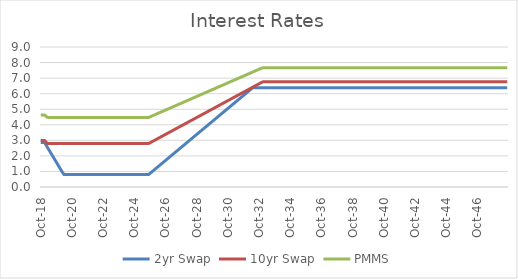
| Category | 2yr Swap | 10yr Swap | PMMS |
|---|---|---|---|
| 2018-10-31 | 2.86 | 2.99 | 4.63 |
| 2018-11-30 | 2.86 | 2.99 | 4.63 |
| 2018-12-31 | 2.86 | 2.99 | 4.63 |
| 2019-01-31 | 2.86 | 2.99 | 4.63 |
| 2019-02-28 | 2.721 | 2.9 | 4.557 |
| 2019-03-31 | 2.581 | 2.809 | 4.484 |
| 2019-04-30 | 2.442 | 2.792 | 4.47 |
| 2019-05-31 | 2.303 | 2.792 | 4.47 |
| 2019-06-30 | 2.163 | 2.792 | 4.47 |
| 2019-07-31 | 2.024 | 2.792 | 4.47 |
| 2019-08-31 | 1.885 | 2.792 | 4.47 |
| 2019-09-30 | 1.745 | 2.792 | 4.469 |
| 2019-10-31 | 1.606 | 2.792 | 4.469 |
| 2019-11-30 | 1.467 | 2.792 | 4.469 |
| 2019-12-31 | 1.327 | 2.792 | 4.469 |
| 2020-01-31 | 1.188 | 2.792 | 4.469 |
| 2020-02-29 | 1.049 | 2.792 | 4.469 |
| 2020-03-31 | 0.909 | 2.792 | 4.469 |
| 2020-04-30 | 0.798 | 2.792 | 4.469 |
| 2020-05-31 | 0.798 | 2.792 | 4.469 |
| 2020-06-30 | 0.798 | 2.792 | 4.469 |
| 2020-07-31 | 0.798 | 2.792 | 4.469 |
| 2020-08-31 | 0.798 | 2.792 | 4.469 |
| 2020-09-30 | 0.798 | 2.792 | 4.469 |
| 2020-10-31 | 0.798 | 2.792 | 4.469 |
| 2020-11-30 | 0.798 | 2.792 | 4.469 |
| 2020-12-31 | 0.798 | 2.792 | 4.469 |
| 2021-01-31 | 0.798 | 2.792 | 4.469 |
| 2021-02-28 | 0.798 | 2.792 | 4.469 |
| 2021-03-31 | 0.798 | 2.792 | 4.469 |
| 2021-04-30 | 0.798 | 2.792 | 4.469 |
| 2021-05-31 | 0.798 | 2.792 | 4.469 |
| 2021-06-30 | 0.798 | 2.792 | 4.469 |
| 2021-07-31 | 0.798 | 2.792 | 4.469 |
| 2021-08-31 | 0.798 | 2.792 | 4.469 |
| 2021-09-30 | 0.798 | 2.792 | 4.469 |
| 2021-10-31 | 0.798 | 2.792 | 4.469 |
| 2021-11-30 | 0.798 | 2.792 | 4.469 |
| 2021-12-31 | 0.798 | 2.792 | 4.469 |
| 2022-01-31 | 0.798 | 2.792 | 4.469 |
| 2022-02-28 | 0.798 | 2.792 | 4.469 |
| 2022-03-31 | 0.798 | 2.792 | 4.469 |
| 2022-04-30 | 0.798 | 2.792 | 4.469 |
| 2022-05-31 | 0.798 | 2.792 | 4.469 |
| 2022-06-30 | 0.798 | 2.792 | 4.469 |
| 2022-07-31 | 0.798 | 2.792 | 4.469 |
| 2022-08-31 | 0.798 | 2.792 | 4.469 |
| 2022-09-30 | 0.798 | 2.792 | 4.469 |
| 2022-10-31 | 0.798 | 2.792 | 4.469 |
| 2022-11-30 | 0.798 | 2.792 | 4.469 |
| 2022-12-31 | 0.798 | 2.792 | 4.469 |
| 2023-01-31 | 0.798 | 2.792 | 4.469 |
| 2023-02-28 | 0.798 | 2.792 | 4.469 |
| 2023-03-31 | 0.798 | 2.792 | 4.469 |
| 2023-04-30 | 0.798 | 2.792 | 4.469 |
| 2023-05-31 | 0.798 | 2.792 | 4.469 |
| 2023-06-30 | 0.798 | 2.792 | 4.469 |
| 2023-07-31 | 0.798 | 2.792 | 4.469 |
| 2023-08-31 | 0.798 | 2.792 | 4.469 |
| 2023-09-30 | 0.798 | 2.792 | 4.469 |
| 2023-10-31 | 0.798 | 2.792 | 4.469 |
| 2023-11-30 | 0.798 | 2.792 | 4.469 |
| 2023-12-31 | 0.798 | 2.792 | 4.469 |
| 2024-01-31 | 0.798 | 2.792 | 4.469 |
| 2024-02-29 | 0.798 | 2.792 | 4.469 |
| 2024-03-31 | 0.798 | 2.792 | 4.469 |
| 2024-04-30 | 0.798 | 2.792 | 4.469 |
| 2024-05-31 | 0.798 | 2.792 | 4.469 |
| 2024-06-30 | 0.798 | 2.792 | 4.469 |
| 2024-07-31 | 0.798 | 2.792 | 4.469 |
| 2024-08-31 | 0.798 | 2.792 | 4.469 |
| 2024-09-30 | 0.798 | 2.792 | 4.469 |
| 2024-10-31 | 0.798 | 2.792 | 4.469 |
| 2024-11-30 | 0.798 | 2.792 | 4.469 |
| 2024-12-31 | 0.798 | 2.792 | 4.469 |
| 2025-01-31 | 0.798 | 2.792 | 4.469 |
| 2025-02-28 | 0.798 | 2.792 | 4.469 |
| 2025-03-31 | 0.798 | 2.792 | 4.469 |
| 2025-04-30 | 0.798 | 2.792 | 4.469 |
| 2025-05-31 | 0.798 | 2.792 | 4.469 |
| 2025-06-30 | 0.798 | 2.792 | 4.469 |
| 2025-07-31 | 0.798 | 2.792 | 4.469 |
| 2025-08-31 | 0.798 | 2.792 | 4.469 |
| 2025-09-30 | 0.798 | 2.792 | 4.469 |
| 2025-10-31 | 0.868 | 2.837 | 4.505 |
| 2025-11-30 | 0.938 | 2.882 | 4.542 |
| 2025-12-31 | 1.007 | 2.928 | 4.578 |
| 2026-01-31 | 1.077 | 2.973 | 4.615 |
| 2026-02-28 | 1.147 | 3.018 | 4.651 |
| 2026-03-31 | 1.216 | 3.063 | 4.688 |
| 2026-04-30 | 1.286 | 3.108 | 4.724 |
| 2026-05-31 | 1.356 | 3.154 | 4.761 |
| 2026-06-30 | 1.425 | 3.199 | 4.797 |
| 2026-07-31 | 1.495 | 3.244 | 4.834 |
| 2026-08-31 | 1.565 | 3.289 | 4.87 |
| 2026-09-30 | 1.634 | 3.334 | 4.906 |
| 2026-10-31 | 1.704 | 3.38 | 4.943 |
| 2026-11-30 | 1.774 | 3.425 | 4.979 |
| 2026-12-31 | 1.843 | 3.47 | 5.016 |
| 2027-01-31 | 1.913 | 3.515 | 5.052 |
| 2027-02-28 | 1.983 | 3.561 | 5.089 |
| 2027-03-31 | 2.052 | 3.606 | 5.125 |
| 2027-04-30 | 2.122 | 3.651 | 5.162 |
| 2027-05-31 | 2.192 | 3.696 | 5.198 |
| 2027-06-30 | 2.261 | 3.741 | 5.235 |
| 2027-07-31 | 2.331 | 3.787 | 5.271 |
| 2027-08-31 | 2.401 | 3.832 | 5.308 |
| 2027-09-30 | 2.47 | 3.877 | 5.344 |
| 2027-10-31 | 2.54 | 3.922 | 5.381 |
| 2027-11-30 | 2.61 | 3.968 | 5.417 |
| 2027-12-31 | 2.679 | 4.013 | 5.454 |
| 2028-01-31 | 2.749 | 4.058 | 5.49 |
| 2028-02-29 | 2.819 | 4.103 | 5.527 |
| 2028-03-31 | 2.888 | 4.148 | 5.563 |
| 2028-04-30 | 2.958 | 4.194 | 5.6 |
| 2028-05-31 | 3.028 | 4.239 | 5.636 |
| 2028-06-30 | 3.097 | 4.284 | 5.673 |
| 2028-07-31 | 3.167 | 4.329 | 5.709 |
| 2028-08-31 | 3.237 | 4.375 | 5.746 |
| 2028-09-30 | 3.306 | 4.42 | 5.782 |
| 2028-10-31 | 3.376 | 4.465 | 5.818 |
| 2028-11-30 | 3.446 | 4.51 | 5.855 |
| 2028-12-31 | 3.515 | 4.555 | 5.891 |
| 2029-01-31 | 3.585 | 4.601 | 5.928 |
| 2029-02-28 | 3.655 | 4.646 | 5.964 |
| 2029-03-31 | 3.724 | 4.691 | 6.001 |
| 2029-04-30 | 3.794 | 4.736 | 6.037 |
| 2029-05-31 | 3.864 | 4.782 | 6.074 |
| 2029-06-30 | 3.933 | 4.827 | 6.11 |
| 2029-07-31 | 4.003 | 4.872 | 6.147 |
| 2029-08-31 | 4.073 | 4.917 | 6.183 |
| 2029-09-30 | 4.142 | 4.962 | 6.22 |
| 2029-10-31 | 4.212 | 5.008 | 6.256 |
| 2029-11-30 | 4.282 | 5.053 | 6.293 |
| 2029-12-31 | 4.351 | 5.098 | 6.329 |
| 2030-01-31 | 4.421 | 5.143 | 6.366 |
| 2030-02-28 | 4.491 | 5.189 | 6.402 |
| 2030-03-31 | 4.56 | 5.234 | 6.439 |
| 2030-04-30 | 4.63 | 5.279 | 6.475 |
| 2030-05-31 | 4.7 | 5.324 | 6.512 |
| 2030-06-30 | 4.769 | 5.369 | 6.548 |
| 2030-07-31 | 4.839 | 5.415 | 6.585 |
| 2030-08-31 | 4.909 | 5.46 | 6.621 |
| 2030-09-30 | 4.978 | 5.505 | 6.658 |
| 2030-10-31 | 5.048 | 5.55 | 6.694 |
| 2030-11-30 | 5.118 | 5.596 | 6.73 |
| 2030-12-31 | 5.187 | 5.641 | 6.767 |
| 2031-01-31 | 5.257 | 5.686 | 6.803 |
| 2031-02-28 | 5.327 | 5.731 | 6.84 |
| 2031-03-31 | 5.396 | 5.776 | 6.876 |
| 2031-04-30 | 5.466 | 5.822 | 6.913 |
| 2031-05-31 | 5.536 | 5.867 | 6.949 |
| 2031-06-30 | 5.605 | 5.912 | 6.986 |
| 2031-07-31 | 5.675 | 5.957 | 7.022 |
| 2031-08-31 | 5.745 | 6.003 | 7.059 |
| 2031-09-30 | 5.814 | 6.048 | 7.095 |
| 2031-10-31 | 5.884 | 6.093 | 7.132 |
| 2031-11-30 | 5.954 | 6.138 | 7.168 |
| 2031-12-31 | 6.023 | 6.183 | 7.205 |
| 2032-01-31 | 6.093 | 6.229 | 7.241 |
| 2032-02-29 | 6.163 | 6.274 | 7.278 |
| 2032-03-31 | 6.232 | 6.319 | 7.314 |
| 2032-04-30 | 6.302 | 6.364 | 7.351 |
| 2032-05-31 | 6.372 | 6.409 | 7.387 |
| 2032-06-30 | 6.387 | 6.455 | 7.424 |
| 2032-07-31 | 6.387 | 6.5 | 7.46 |
| 2032-08-31 | 6.387 | 6.545 | 7.496 |
| 2032-09-30 | 6.387 | 6.59 | 7.533 |
| 2032-10-31 | 6.387 | 6.636 | 7.569 |
| 2032-11-30 | 6.387 | 6.681 | 7.606 |
| 2032-12-31 | 6.387 | 6.726 | 7.642 |
| 2033-01-31 | 6.387 | 6.758 | 7.668 |
| 2033-02-28 | 6.387 | 6.758 | 7.668 |
| 2033-03-31 | 6.387 | 6.758 | 7.668 |
| 2033-04-30 | 6.387 | 6.758 | 7.668 |
| 2033-05-31 | 6.387 | 6.758 | 7.668 |
| 2033-06-30 | 6.387 | 6.758 | 7.668 |
| 2033-07-31 | 6.387 | 6.758 | 7.668 |
| 2033-08-31 | 6.387 | 6.758 | 7.668 |
| 2033-09-30 | 6.387 | 6.758 | 7.668 |
| 2033-10-31 | 6.387 | 6.758 | 7.668 |
| 2033-11-30 | 6.387 | 6.758 | 7.668 |
| 2033-12-31 | 6.387 | 6.758 | 7.668 |
| 2034-01-31 | 6.387 | 6.758 | 7.668 |
| 2034-02-28 | 6.387 | 6.758 | 7.668 |
| 2034-03-31 | 6.387 | 6.758 | 7.668 |
| 2034-04-30 | 6.387 | 6.758 | 7.668 |
| 2034-05-31 | 6.387 | 6.758 | 7.668 |
| 2034-06-30 | 6.387 | 6.758 | 7.668 |
| 2034-07-31 | 6.387 | 6.758 | 7.668 |
| 2034-08-31 | 6.387 | 6.758 | 7.668 |
| 2034-09-30 | 6.387 | 6.758 | 7.668 |
| 2034-10-31 | 6.387 | 6.758 | 7.668 |
| 2034-11-30 | 6.387 | 6.758 | 7.668 |
| 2034-12-31 | 6.387 | 6.758 | 7.668 |
| 2035-01-31 | 6.387 | 6.758 | 7.668 |
| 2035-02-28 | 6.387 | 6.758 | 7.668 |
| 2035-03-31 | 6.387 | 6.758 | 7.668 |
| 2035-04-30 | 6.387 | 6.758 | 7.668 |
| 2035-05-31 | 6.387 | 6.758 | 7.668 |
| 2035-06-30 | 6.387 | 6.758 | 7.668 |
| 2035-07-31 | 6.387 | 6.758 | 7.668 |
| 2035-08-31 | 6.387 | 6.758 | 7.668 |
| 2035-09-30 | 6.387 | 6.758 | 7.668 |
| 2035-10-31 | 6.387 | 6.758 | 7.668 |
| 2035-11-30 | 6.387 | 6.758 | 7.668 |
| 2035-12-31 | 6.387 | 6.758 | 7.668 |
| 2036-01-31 | 6.387 | 6.758 | 7.668 |
| 2036-02-29 | 6.387 | 6.758 | 7.668 |
| 2036-03-31 | 6.387 | 6.758 | 7.668 |
| 2036-04-30 | 6.387 | 6.758 | 7.668 |
| 2036-05-31 | 6.387 | 6.758 | 7.668 |
| 2036-06-30 | 6.387 | 6.758 | 7.668 |
| 2036-07-31 | 6.387 | 6.758 | 7.668 |
| 2036-08-31 | 6.387 | 6.758 | 7.668 |
| 2036-09-30 | 6.387 | 6.758 | 7.668 |
| 2036-10-31 | 6.387 | 6.758 | 7.668 |
| 2036-11-30 | 6.387 | 6.758 | 7.668 |
| 2036-12-31 | 6.387 | 6.758 | 7.668 |
| 2037-01-31 | 6.387 | 6.758 | 7.668 |
| 2037-02-28 | 6.387 | 6.758 | 7.668 |
| 2037-03-31 | 6.387 | 6.758 | 7.668 |
| 2037-04-30 | 6.387 | 6.758 | 7.668 |
| 2037-05-31 | 6.387 | 6.758 | 7.668 |
| 2037-06-30 | 6.387 | 6.758 | 7.668 |
| 2037-07-31 | 6.387 | 6.758 | 7.668 |
| 2037-08-31 | 6.387 | 6.758 | 7.668 |
| 2037-09-30 | 6.387 | 6.758 | 7.668 |
| 2037-10-31 | 6.387 | 6.758 | 7.668 |
| 2037-11-30 | 6.387 | 6.758 | 7.668 |
| 2037-12-31 | 6.387 | 6.758 | 7.668 |
| 2038-01-31 | 6.387 | 6.758 | 7.668 |
| 2038-02-28 | 6.387 | 6.758 | 7.668 |
| 2038-03-31 | 6.387 | 6.758 | 7.668 |
| 2038-04-30 | 6.387 | 6.758 | 7.668 |
| 2038-05-31 | 6.387 | 6.758 | 7.668 |
| 2038-06-30 | 6.387 | 6.758 | 7.668 |
| 2038-07-31 | 6.387 | 6.758 | 7.668 |
| 2038-08-31 | 6.387 | 6.758 | 7.668 |
| 2038-09-30 | 6.387 | 6.758 | 7.668 |
| 2038-10-31 | 6.387 | 6.758 | 7.668 |
| 2038-11-30 | 6.387 | 6.758 | 7.668 |
| 2038-12-31 | 6.387 | 6.758 | 7.668 |
| 2039-01-31 | 6.387 | 6.758 | 7.668 |
| 2039-02-28 | 6.387 | 6.758 | 7.668 |
| 2039-03-31 | 6.387 | 6.758 | 7.668 |
| 2039-04-30 | 6.387 | 6.758 | 7.668 |
| 2039-05-31 | 6.387 | 6.758 | 7.668 |
| 2039-06-30 | 6.387 | 6.758 | 7.668 |
| 2039-07-31 | 6.387 | 6.758 | 7.668 |
| 2039-08-31 | 6.387 | 6.758 | 7.668 |
| 2039-09-30 | 6.387 | 6.758 | 7.668 |
| 2039-10-31 | 6.387 | 6.758 | 7.668 |
| 2039-11-30 | 6.387 | 6.758 | 7.668 |
| 2039-12-31 | 6.387 | 6.758 | 7.668 |
| 2040-01-31 | 6.387 | 6.758 | 7.668 |
| 2040-02-29 | 6.387 | 6.758 | 7.668 |
| 2040-03-31 | 6.387 | 6.758 | 7.668 |
| 2040-04-30 | 6.387 | 6.758 | 7.668 |
| 2040-05-31 | 6.387 | 6.758 | 7.668 |
| 2040-06-30 | 6.387 | 6.758 | 7.668 |
| 2040-07-31 | 6.387 | 6.758 | 7.668 |
| 2040-08-31 | 6.387 | 6.758 | 7.668 |
| 2040-09-30 | 6.387 | 6.758 | 7.668 |
| 2040-10-31 | 6.387 | 6.758 | 7.668 |
| 2040-11-30 | 6.387 | 6.758 | 7.668 |
| 2040-12-31 | 6.387 | 6.758 | 7.668 |
| 2041-01-31 | 6.387 | 6.758 | 7.668 |
| 2041-02-28 | 6.387 | 6.758 | 7.668 |
| 2041-03-31 | 6.387 | 6.758 | 7.668 |
| 2041-04-30 | 6.387 | 6.758 | 7.668 |
| 2041-05-31 | 6.387 | 6.758 | 7.668 |
| 2041-06-30 | 6.387 | 6.758 | 7.668 |
| 2041-07-31 | 6.387 | 6.758 | 7.668 |
| 2041-08-31 | 6.387 | 6.758 | 7.668 |
| 2041-09-30 | 6.387 | 6.758 | 7.668 |
| 2041-10-31 | 6.387 | 6.758 | 7.668 |
| 2041-11-30 | 6.387 | 6.758 | 7.668 |
| 2041-12-31 | 6.387 | 6.758 | 7.668 |
| 2042-01-31 | 6.387 | 6.758 | 7.668 |
| 2042-02-28 | 6.387 | 6.758 | 7.668 |
| 2042-03-31 | 6.387 | 6.758 | 7.668 |
| 2042-04-30 | 6.387 | 6.758 | 7.668 |
| 2042-05-31 | 6.387 | 6.758 | 7.668 |
| 2042-06-30 | 6.387 | 6.758 | 7.668 |
| 2042-07-31 | 6.387 | 6.758 | 7.668 |
| 2042-08-31 | 6.387 | 6.758 | 7.668 |
| 2042-09-30 | 6.387 | 6.758 | 7.668 |
| 2042-10-31 | 6.387 | 6.758 | 7.668 |
| 2042-11-30 | 6.387 | 6.758 | 7.668 |
| 2042-12-31 | 6.387 | 6.758 | 7.668 |
| 2043-01-31 | 6.387 | 6.758 | 7.668 |
| 2043-02-28 | 6.387 | 6.758 | 7.668 |
| 2043-03-31 | 6.387 | 6.758 | 7.668 |
| 2043-04-30 | 6.387 | 6.758 | 7.668 |
| 2043-05-31 | 6.387 | 6.758 | 7.668 |
| 2043-06-30 | 6.387 | 6.758 | 7.668 |
| 2043-07-31 | 6.387 | 6.758 | 7.668 |
| 2043-08-31 | 6.387 | 6.758 | 7.668 |
| 2043-09-30 | 6.387 | 6.758 | 7.668 |
| 2043-10-31 | 6.387 | 6.758 | 7.668 |
| 2043-11-30 | 6.387 | 6.758 | 7.668 |
| 2043-12-31 | 6.387 | 6.758 | 7.668 |
| 2044-01-31 | 6.387 | 6.758 | 7.668 |
| 2044-02-29 | 6.387 | 6.758 | 7.668 |
| 2044-03-31 | 6.387 | 6.758 | 7.668 |
| 2044-04-30 | 6.387 | 6.758 | 7.668 |
| 2044-05-31 | 6.387 | 6.758 | 7.668 |
| 2044-06-30 | 6.387 | 6.758 | 7.668 |
| 2044-07-31 | 6.387 | 6.758 | 7.668 |
| 2044-08-31 | 6.387 | 6.758 | 7.668 |
| 2044-09-30 | 6.387 | 6.758 | 7.668 |
| 2044-10-31 | 6.387 | 6.758 | 7.668 |
| 2044-11-30 | 6.387 | 6.758 | 7.668 |
| 2044-12-31 | 6.387 | 6.758 | 7.668 |
| 2045-01-31 | 6.387 | 6.758 | 7.668 |
| 2045-02-28 | 6.387 | 6.758 | 7.668 |
| 2045-03-31 | 6.387 | 6.758 | 7.668 |
| 2045-04-30 | 6.387 | 6.758 | 7.668 |
| 2045-05-31 | 6.387 | 6.758 | 7.668 |
| 2045-06-30 | 6.387 | 6.758 | 7.668 |
| 2045-07-31 | 6.387 | 6.758 | 7.668 |
| 2045-08-31 | 6.387 | 6.758 | 7.668 |
| 2045-09-30 | 6.387 | 6.758 | 7.668 |
| 2045-10-31 | 6.387 | 6.758 | 7.668 |
| 2045-11-30 | 6.387 | 6.758 | 7.668 |
| 2045-12-31 | 6.387 | 6.758 | 7.668 |
| 2046-01-31 | 6.387 | 6.758 | 7.668 |
| 2046-02-28 | 6.387 | 6.758 | 7.668 |
| 2046-03-31 | 6.387 | 6.758 | 7.668 |
| 2046-04-30 | 6.387 | 6.758 | 7.668 |
| 2046-05-31 | 6.387 | 6.758 | 7.668 |
| 2046-06-30 | 6.387 | 6.758 | 7.668 |
| 2046-07-31 | 6.387 | 6.758 | 7.668 |
| 2046-08-31 | 6.387 | 6.758 | 7.668 |
| 2046-09-30 | 6.387 | 6.758 | 7.668 |
| 2046-10-31 | 6.387 | 6.758 | 7.668 |
| 2046-11-30 | 6.387 | 6.758 | 7.668 |
| 2046-12-31 | 6.387 | 6.758 | 7.668 |
| 2047-01-31 | 6.387 | 6.758 | 7.668 |
| 2047-02-28 | 6.387 | 6.758 | 7.668 |
| 2047-03-31 | 6.387 | 6.758 | 7.668 |
| 2047-04-30 | 6.387 | 6.758 | 7.668 |
| 2047-05-31 | 6.387 | 6.758 | 7.668 |
| 2047-06-30 | 6.387 | 6.758 | 7.668 |
| 2047-07-31 | 6.387 | 6.758 | 7.668 |
| 2047-08-31 | 6.387 | 6.758 | 7.668 |
| 2047-09-30 | 6.387 | 6.758 | 7.668 |
| 2047-10-31 | 6.387 | 6.758 | 7.668 |
| 2047-11-30 | 6.387 | 6.758 | 7.668 |
| 2047-12-31 | 6.387 | 6.758 | 7.668 |
| 2048-01-31 | 6.387 | 6.758 | 7.668 |
| 2048-02-29 | 6.387 | 6.758 | 7.668 |
| 2048-03-31 | 6.387 | 6.758 | 7.668 |
| 2048-04-30 | 6.387 | 6.758 | 7.668 |
| 2048-05-31 | 6.387 | 6.758 | 7.668 |
| 2048-06-30 | 6.387 | 6.758 | 7.668 |
| 2048-07-31 | 6.387 | 6.758 | 7.668 |
| 2048-08-31 | 6.387 | 6.758 | 7.668 |
| 2048-09-30 | 6.387 | 6.758 | 7.668 |